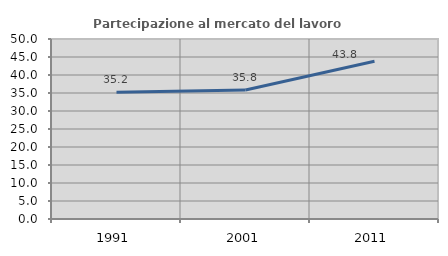
| Category | Partecipazione al mercato del lavoro  femminile |
|---|---|
| 1991.0 | 35.2 |
| 2001.0 | 35.849 |
| 2011.0 | 43.817 |